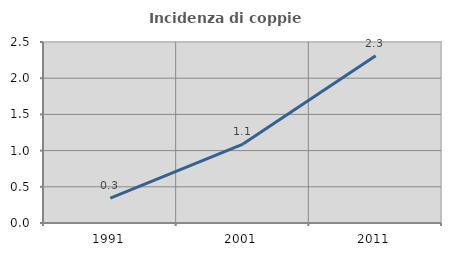
| Category | Incidenza di coppie miste |
|---|---|
| 1991.0 | 0.342 |
| 2001.0 | 1.089 |
| 2011.0 | 2.31 |